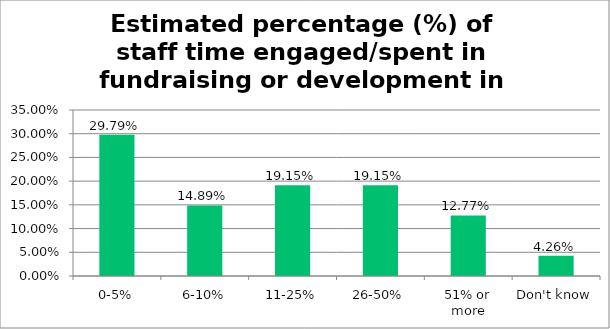
| Category | Responses |
|---|---|
| 0-5% | 0.298 |
| 6-10% | 0.149 |
| 11-25% | 0.192 |
| 26-50% | 0.192 |
| 51% or more | 0.128 |
| Don't know | 0.043 |